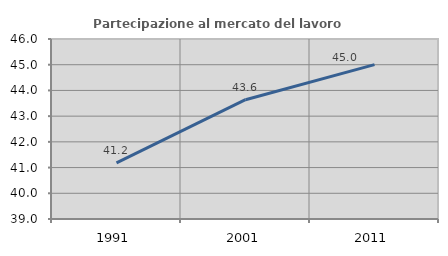
| Category | Partecipazione al mercato del lavoro  femminile |
|---|---|
| 1991.0 | 41.182 |
| 2001.0 | 43.64 |
| 2011.0 | 45.005 |